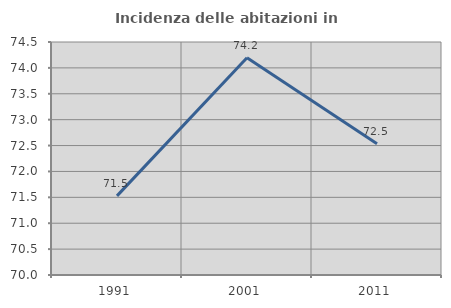
| Category | Incidenza delle abitazioni in proprietà  |
|---|---|
| 1991.0 | 71.528 |
| 2001.0 | 74.197 |
| 2011.0 | 72.534 |